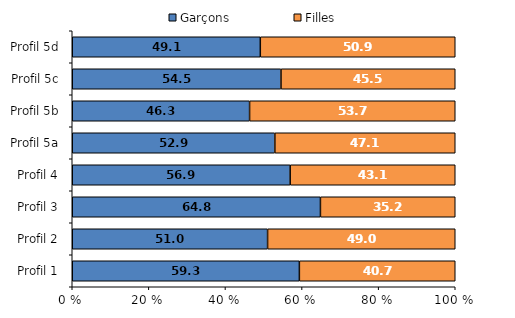
| Category | Garçons | Filles |
|---|---|---|
| Profil 1 | 59.3 | 40.7 |
| Profil 2 | 51 | 49 |
| Profil 3 | 64.8 | 35.2 |
| Profil 4 | 56.9 | 43.1 |
| Profil 5a | 52.9 | 47.1 |
| Profil 5b | 46.3 | 53.7 |
| Profil 5c | 54.5 | 45.5 |
| Profil 5d | 49.1 | 50.9 |